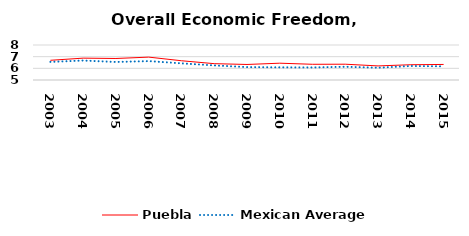
| Category | Puebla | Mexican Average  |
|---|---|---|
| 2003.0 | 6.689 | 6.552 |
| 2004.0 | 6.873 | 6.668 |
| 2005.0 | 6.844 | 6.546 |
| 2006.0 | 6.962 | 6.619 |
| 2007.0 | 6.651 | 6.428 |
| 2008.0 | 6.4 | 6.248 |
| 2009.0 | 6.33 | 6.106 |
| 2010.0 | 6.441 | 6.086 |
| 2011.0 | 6.347 | 6.074 |
| 2012.0 | 6.354 | 6.134 |
| 2013.0 | 6.208 | 6.054 |
| 2014.0 | 6.309 | 6.2 |
| 2015.0 | 6.333 | 6.174 |